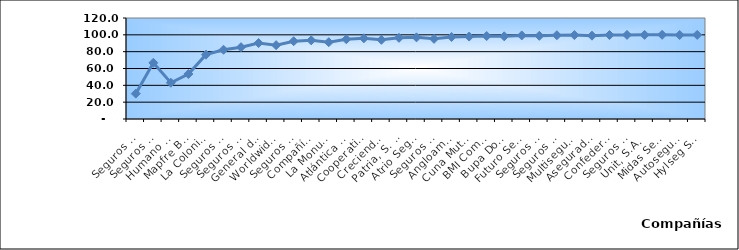
| Category | Series 0 |
|---|---|
| Seguros Universal, S. A. | 30.131 |
| Seguros Reservas, S. A. | 66.75 |
| Humano Seguros, S. A. | 43.097 |
| Mapfre BHD Compañía de Seguros | 53.459 |
| La Colonial, S. A., Compañia De Seguros | 76.423 |
| Seguros Sura, S.A. | 82.275 |
| Seguros Crecer, S. A. | 85.323 |
| General de Seguros, S. A. | 90.252 |
| Worldwide Seguros, S. A. | 87.75 |
| Seguros Pepín, S. A. | 92.418 |
| Compañía Dominicana de Seguros, C. por A. | 93.457 |
| La Monumental de Seguros, S. A. | 91.244 |
| Atlántica Seguros, S. A. | 94.735 |
| Cooperativa Nacional De Seguros, Inc  | 95.855 |
| Creciendo Seguros | 94.084 |
| Patria, S. A., Compañía de Seguros | 96.464 |
| Atrio Seguros S. A. | 97.025 |
| Seguros La Internacional, S. A. | 95.219 |
| Angloamericana de Seguros, S. A. | 97.504 |
| Cuna Mutual Insurance Society Dominicana | 97.956 |
| BMI Compañía de Seguros, S. A. | 98.576 |
| Bupa Dominicana, S. A. | 98.248 |
| Futuro Seguros | 99.275 |
| Seguros APS, S.R.L. | 98.845 |
| Seguros Ademi, S.A. | 99.515 |
| Multiseguros Su, S.A. | 99.693 |
| Aseguradora Agropecuaria Dominicana, S. A. | 99.003 |
| Confederación del Canadá Dominicana, S. A. | 99.78 |
| Seguros Yunen, S.A. | 99.892 |
| Unit, S.A. | 99.954 |
| Midas Seguros, S.A. | 100 |
| Autoseguro, S. A. | 99.82 |
| Hylseg Seguros S.A | 99.904 |